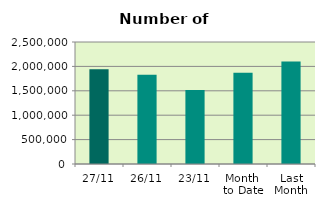
| Category | Series 0 |
|---|---|
| 27/11 | 1940760 |
| 26/11 | 1828150 |
| 23/11 | 1516492 |
| Month 
to Date | 1871016.842 |
| Last
Month | 2101052.87 |